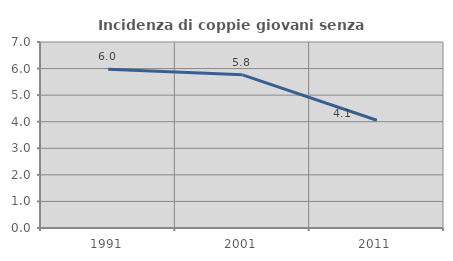
| Category | Incidenza di coppie giovani senza figli |
|---|---|
| 1991.0 | 5.977 |
| 2001.0 | 5.764 |
| 2011.0 | 4.054 |